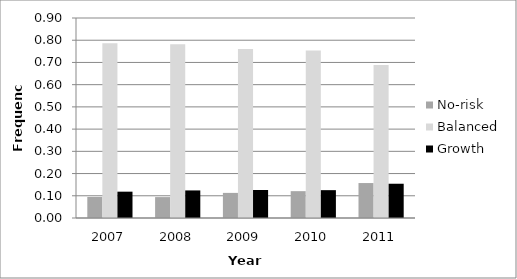
| Category | No-risk | Balanced | Growth |
|---|---|---|---|
| 2007.0 | 0.095 | 0.787 | 0.118 |
| 2008.0 | 0.094 | 0.782 | 0.124 |
| 2009.0 | 0.113 | 0.761 | 0.126 |
| 2010.0 | 0.121 | 0.754 | 0.125 |
| 2011.0 | 0.157 | 0.689 | 0.154 |